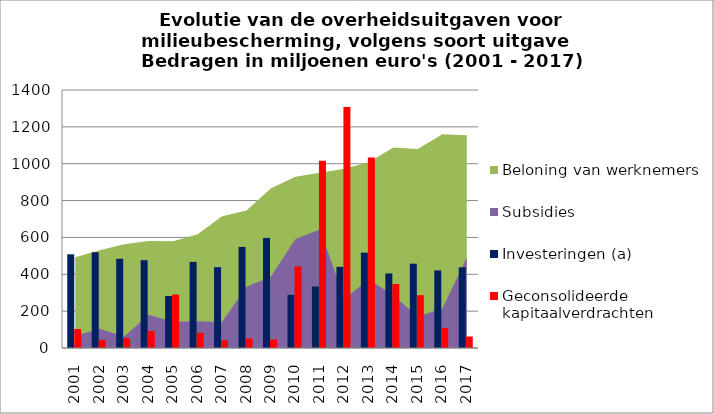
| Category | Investeringen (a) | Geconsolideerde kapitaalverdrachten |
|---|---|---|
| 2001.0 | 508.2 | 102.8 |
| 2002.0 | 519.4 | 44.2 |
| 2003.0 | 484.2 | 54.3 |
| 2004.0 | 476.5 | 92.4 |
| 2005.0 | 282 | 290.1 |
| 2006.0 | 467.5 | 82.5 |
| 2007.0 | 438.7 | 41.5 |
| 2008.0 | 548.5 | 51.7 |
| 2009.0 | 597.4 | 45.6 |
| 2010.0 | 288.3 | 442.7 |
| 2011.0 | 333.6 | 1015.9 |
| 2012.0 | 440.5 | 1307.6 |
| 2013.0 | 517.4 | 1034.1 |
| 2014.0 | 404.5 | 347.4 |
| 2015.0 | 457.5 | 286.9 |
| 2016.0 | 421 | 108.4 |
| 2017.0 | 438 | 62.3 |